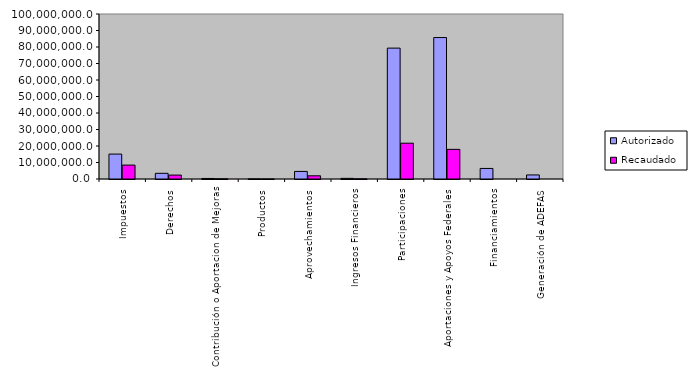
| Category | Autorizado | Recaudado |
|---|---|---|
| Impuestos | 15097540.3 | 8435762.9 |
| Derechos | 3446355.3 | 2368630.9 |
| Contribución o Aportacion de Mejoras | 325649.7 | 101902.4 |
| Productos | 48901.3 | 6338.7 |
| Aprovechamientos | 4590930.7 | 1937040.6 |
| Ingresos Financieros | 390000 | 84713.6 |
| Participaciones | 79323006.5 | 21697386.2 |
| Aportaciones y Apoyos Federales | 85731992.1 | 17956442.2 |
| Financiamientos | 6400000 | 0 |
| Generación de ADEFAS | 2460661.3 | 0 |